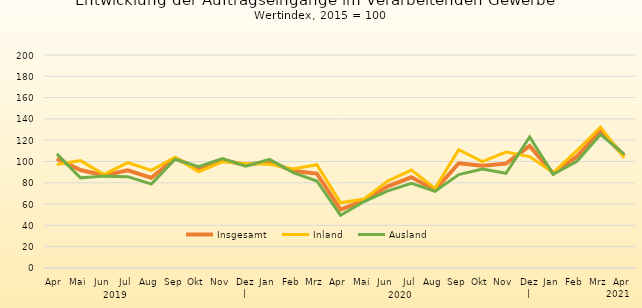
| Category | Insgesamt | Inland | Ausland |
|---|---|---|---|
| Apr | 102.598 | 97.166 | 107.123 |
| Mai | 92.021 | 100.862 | 84.655 |
| Jun | 86.98 | 87.839 | 86.265 |
| Jul | 91.766 | 98.935 | 85.794 |
| Aug | 84.671 | 91.717 | 78.802 |
| Sep | 102.93 | 103.956 | 102.075 |
| Okt | 93.026 | 90.372 | 95.237 |
| Nov | 101.384 | 99.696 | 102.79 |
| Dez | | 96.68 | 98.084 | 95.511 |
| Jan | 99.927 | 97.474 | 101.969 |
| Feb | 91.073 | 92.941 | 89.516 |
| Mrz | 88.659 | 97.022 | 81.692 |
| Apr | 54.797 | 61.217 | 49.449 |
| Mai | 63.501 | 64.799 | 62.421 |
| Jun | 76.618 | 81.619 | 72.452 |
| Jul | 85.149 | 91.955 | 79.479 |
| Aug | 73.202 | 74.782 | 71.886 |
| Sep | 98.332 | 111.146 | 87.659 |
| Okt | 96.082 | 99.932 | 92.875 |
| Nov | 97.96 | 108.787 | 88.94 |
| Dez | | 114.67 | 104.588 | 123.069 |
| Jan | 88.7 | 89.6 | 88 |
| Feb | 104.8 | 110.2 | 100.2 |
| Mrz | 128.4 | 132.2 | 125.3 |
| Apr | 105.4 | 103.5 | 106.9 |